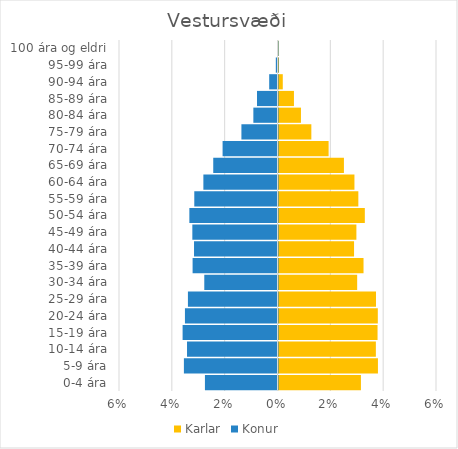
| Category | Karlar | Konur |
|---|---|---|
| 0-4 ára | 0.031 | -0.027 |
| 5-9 ára | 0.038 | -0.035 |
| 10-14 ára | 0.037 | -0.034 |
| 15-19 ára | 0.037 | -0.036 |
| 20-24 ára | 0.038 | -0.035 |
| 25-29 ára | 0.037 | -0.034 |
| 30-34 ára | 0.03 | -0.028 |
| 35-39 ára | 0.032 | -0.032 |
| 40-44 ára | 0.029 | -0.032 |
| 45-49 ára | 0.029 | -0.032 |
| 50-54 ára | 0.033 | -0.033 |
| 55-59 ára | 0.03 | -0.032 |
| 60-64 ára | 0.029 | -0.028 |
| 65-69 ára | 0.025 | -0.024 |
| 70-74 ára | 0.019 | -0.021 |
| 75-79 ára | 0.012 | -0.014 |
| 80-84 ára | 0.009 | -0.009 |
| 85-89 ára | 0.006 | -0.008 |
| 90-94 ára | 0.002 | -0.003 |
| 95-99 ára | 0 | -0.001 |
| 100 ára og eldri | 0 | 0 |